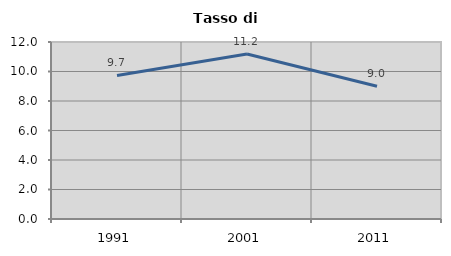
| Category | Tasso di disoccupazione   |
|---|---|
| 1991.0 | 9.732 |
| 2001.0 | 11.186 |
| 2011.0 | 9 |